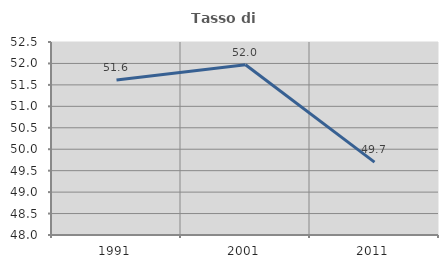
| Category | Tasso di occupazione   |
|---|---|
| 1991.0 | 51.614 |
| 2001.0 | 51.97 |
| 2011.0 | 49.698 |